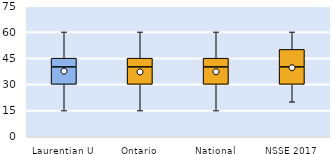
| Category | 25th | 50th | 75th |
|---|---|---|---|
| Laurentian U | 30 | 10 | 5 |
| Ontario | 30 | 10 | 5 |
| National | 30 | 10 | 5 |
| NSSE 2017 | 30 | 10 | 10 |